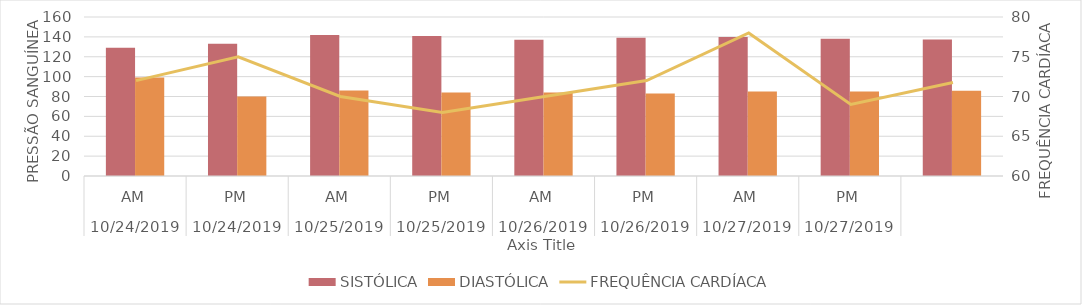
| Category | SISTÓLICA | DIASTÓLICA |
|---|---|---|
| 0 | 129 | 99 |
| 1/1/00 | 133 | 80 |
| 1/2/00 | 142 | 86 |
| 1/3/00 | 141 | 84 |
| 1/4/00 | 137 | 84 |
| 1/5/00 | 139 | 83 |
| 1/6/00 | 140 | 85 |
| 1/7/00 | 138 | 85 |